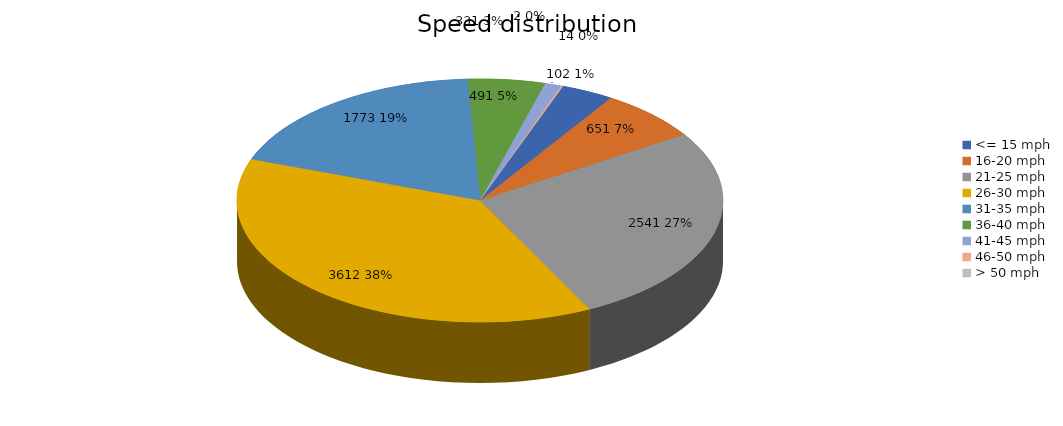
| Category | Series 0 |
|---|---|
| <= 15 mph | 331 |
| 16-20 mph | 651 |
| 21-25 mph | 2541 |
| 26-30 mph | 3612 |
| 31-35 mph | 1773 |
| 36-40 mph | 491 |
| 41-45 mph | 102 |
| 46-50 mph | 14 |
| > 50 mph | 2 |